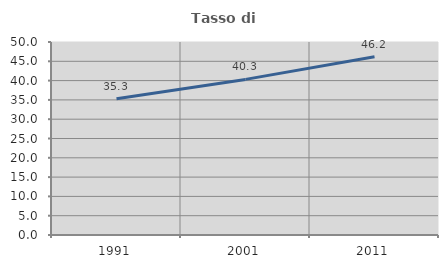
| Category | Tasso di occupazione   |
|---|---|
| 1991.0 | 35.304 |
| 2001.0 | 40.312 |
| 2011.0 | 46.164 |